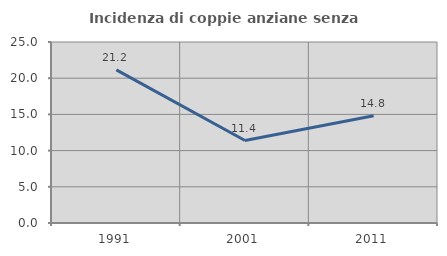
| Category | Incidenza di coppie anziane senza figli  |
|---|---|
| 1991.0 | 21.154 |
| 2001.0 | 11.392 |
| 2011.0 | 14.815 |